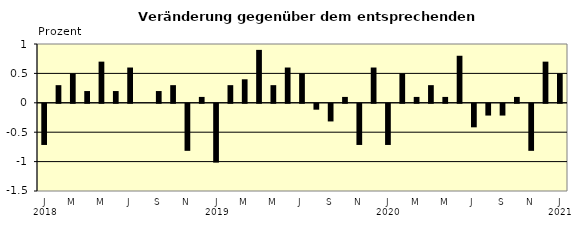
| Category | Series 0 |
|---|---|
| 0 | -0.7 |
| 1 | 0.3 |
| 2 | 0.5 |
| 3 | 0.2 |
| 4 | 0.7 |
| 5 | 0.2 |
| 6 | 0.6 |
| 7 | 0 |
| 8 | 0.2 |
| 9 | 0.3 |
| 10 | -0.8 |
| 11 | 0.1 |
| 12 | -1 |
| 13 | 0.3 |
| 14 | 0.4 |
| 15 | 0.9 |
| 16 | 0.3 |
| 17 | 0.6 |
| 18 | 0.5 |
| 19 | -0.1 |
| 20 | -0.3 |
| 21 | 0.1 |
| 22 | -0.7 |
| 23 | 0.6 |
| 24 | -0.7 |
| 25 | 0.5 |
| 26 | 0.1 |
| 27 | 0.3 |
| 28 | 0.1 |
| 29 | 0.8 |
| 30 | -0.4 |
| 31 | -0.2 |
| 32 | -0.2 |
| 33 | 0.1 |
| 34 | -0.8 |
| 35 | 0.7 |
| 36 | 0.5 |